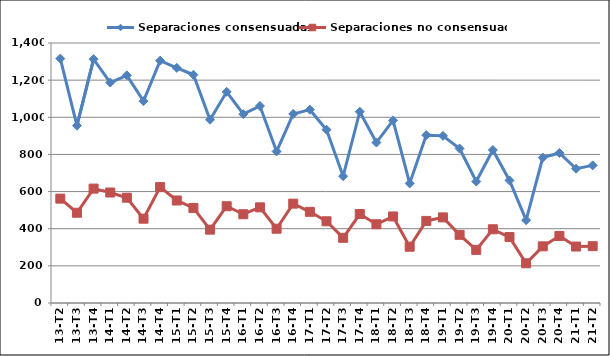
| Category | Separaciones consensuadas | Separaciones no consensuadas |
|---|---|---|
| 13-T2 | 1316 | 562 |
| 13-T3 | 955 | 486 |
| 13-T4 | 1313 | 616 |
| 14-T1 | 1187 | 595 |
| 14-T2 | 1226 | 567 |
| 14-T3 | 1087 | 454 |
| 14-T4 | 1305 | 624 |
| 15-T1 | 1266 | 552 |
| 15-T2 | 1229 | 512 |
| 15-T3 | 987 | 395 |
| 15-T4 | 1137 | 521 |
| 16-T1 | 1017 | 478 |
| 16-T2 | 1061 | 515 |
| 16-T3 | 816 | 400 |
| 16-T4 | 1018 | 535 |
| 17-T1 | 1041 | 491 |
| 17-T2 | 933 | 440 |
| 17-T3 | 683 | 351 |
| 17-T4 | 1030 | 479 |
| 18-T1 | 864 | 424 |
| 18-T2 | 983 | 466 |
| 18-T3 | 644 | 303 |
| 18-T4 | 904 | 442 |
| 19-T1 | 900 | 461 |
| 19-T2 | 832 | 367 |
| 19-T3 | 654 | 286 |
| 19-T4 | 824 | 397 |
| 20-T1 | 660 | 355 |
| 20-T2 | 446 | 214 |
| 20-T3 | 783 | 305 |
| 20-T4 | 808 | 361 |
| 21-T1 | 723 | 304 |
| 21-T2 | 741 | 306 |